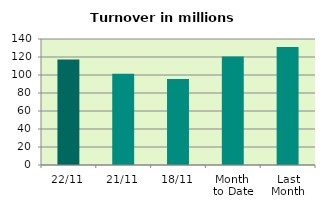
| Category | Series 0 |
|---|---|
| 22/11 | 117.25 |
| 21/11 | 101.499 |
| 18/11 | 95.658 |
| Month 
to Date | 120.444 |
| Last
Month | 131.017 |